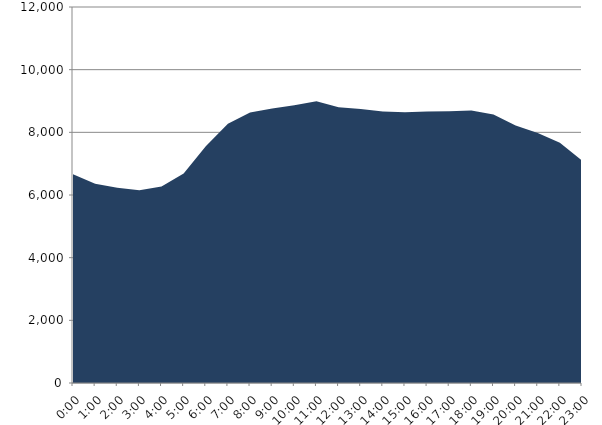
| Category | Series 0 | Series 1 |
|---|---|---|
| 2022-07-20 |  | 6664.388 |
| 2022-07-20 01:00:00 |  | 6356.11 |
| 2022-07-20 02:00:00 |  | 6233.023 |
| 2022-07-20 03:00:00 |  | 6152.193 |
| 2022-07-20 04:00:00 |  | 6271.045 |
| 2022-07-20 05:00:00 |  | 6688.385 |
| 2022-07-20 06:00:00 |  | 7558.361 |
| 2022-07-20 07:00:00 |  | 8274.001 |
| 2022-07-20 08:00:00 |  | 8629.441 |
| 2022-07-20 09:00:00 |  | 8757.662 |
| 2022-07-20 10:00:00 |  | 8864.301 |
| 2022-07-20 11:00:00 |  | 8993.474 |
| 2022-07-20 12:00:00 |  | 8800.092 |
| 2022-07-20 13:00:00 |  | 8744.67 |
| 2022-07-20 14:00:00 |  | 8663.461 |
| 2022-07-20 15:00:00 |  | 8639.321 |
| 2022-07-20 16:00:00 |  | 8661.572 |
| 2022-07-20 17:00:00 |  | 8676.729 |
| 2022-07-20 18:00:00 |  | 8693.87 |
| 2022-07-20 19:00:00 |  | 8571.777 |
| 2022-07-20 20:00:00 |  | 8221.366 |
| 2022-07-20 21:00:00 |  | 7979.263 |
| 2022-07-20 22:00:00 |  | 7667.914 |
| 2022-07-20 23:00:00 |  | 7099.85 |